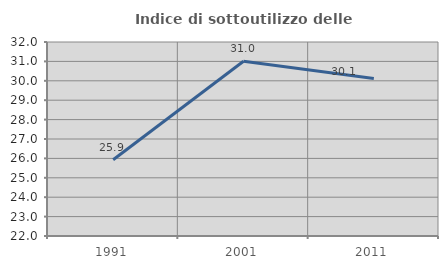
| Category | Indice di sottoutilizzo delle abitazioni  |
|---|---|
| 1991.0 | 25.931 |
| 2001.0 | 31.007 |
| 2011.0 | 30.114 |